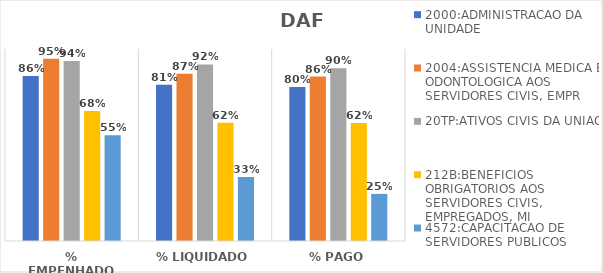
| Category | 2000:ADMINISTRACAO DA UNIDADE | 2004:ASSISTENCIA MEDICA E ODONTOLOGICA AOS SERVIDORES CIVIS, EMPR | 20TP:ATIVOS CIVIS DA UNIAO | 212B:BENEFICIOS OBRIGATORIOS AOS SERVIDORES CIVIS, EMPREGADOS, MI | 4572:CAPACITACAO DE SERVIDORES PUBLICOS FEDERAIS EM PROCESSO DE Q |
|---|---|---|---|---|---|
| % EMPENHADO | 0.859 | 0.949 | 0.938 | 0.677 | 0.551 |
| % LIQUIDADO | 0.813 | 0.871 | 0.92 | 0.615 | 0.334 |
| % PAGO | 0.802 | 0.856 | 0.899 | 0.615 | 0.245 |